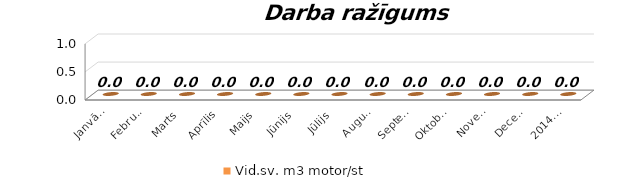
| Category | Vid.sv. m3 motor/st |
|---|---|
| Janvāris | 0 |
| Februāris | 0 |
| Marts | 0 |
| Aprīlis | 0 |
| Maijs | 0 |
| Jūnijs | 0 |
| Jūlijs | 0 |
| Augusts | 0 |
| Septembris | 0 |
| Oktobris | 0 |
| Novembris | 0 |
| Decembris | 0 |
| 2014.g. kopā | 0 |